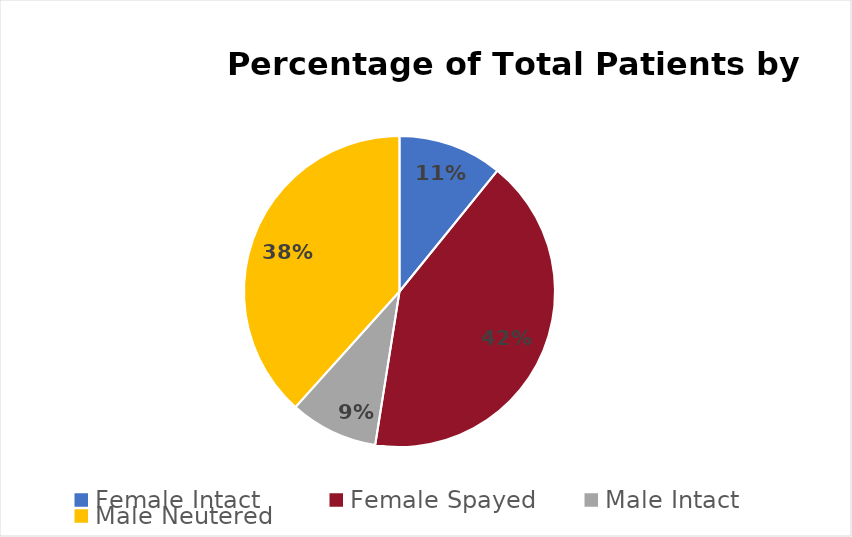
| Category | Series 0 |
|---|---|
| Female Intact | 13 |
| Female Spayed | 50 |
| Male Intact | 11 |
| Male Neutered | 46 |